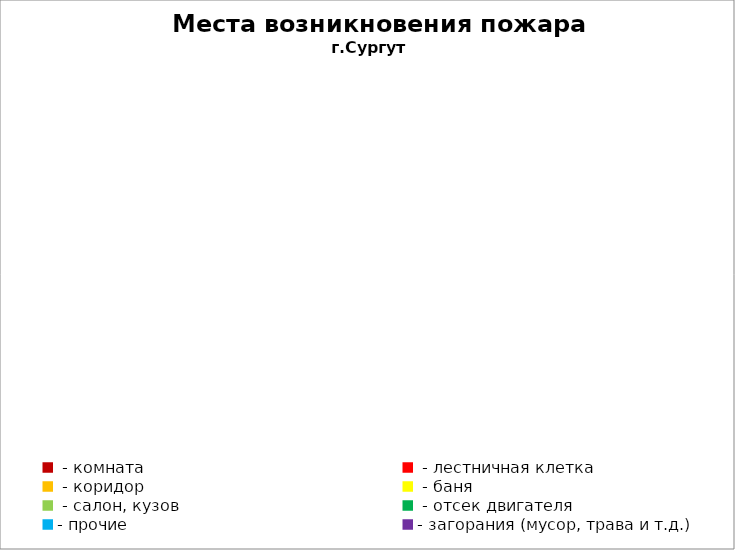
| Category | Места возникновения пожара |
|---|---|
|  - комната | 25 |
|  - лестничная клетка | 2 |
|  - коридор | 2 |
|  - баня | 2 |
|  - салон, кузов | 5 |
|  - отсек двигателя | 9 |
| - прочие | 18 |
| - загорания (мусор, трава и т.д.)  | 13 |